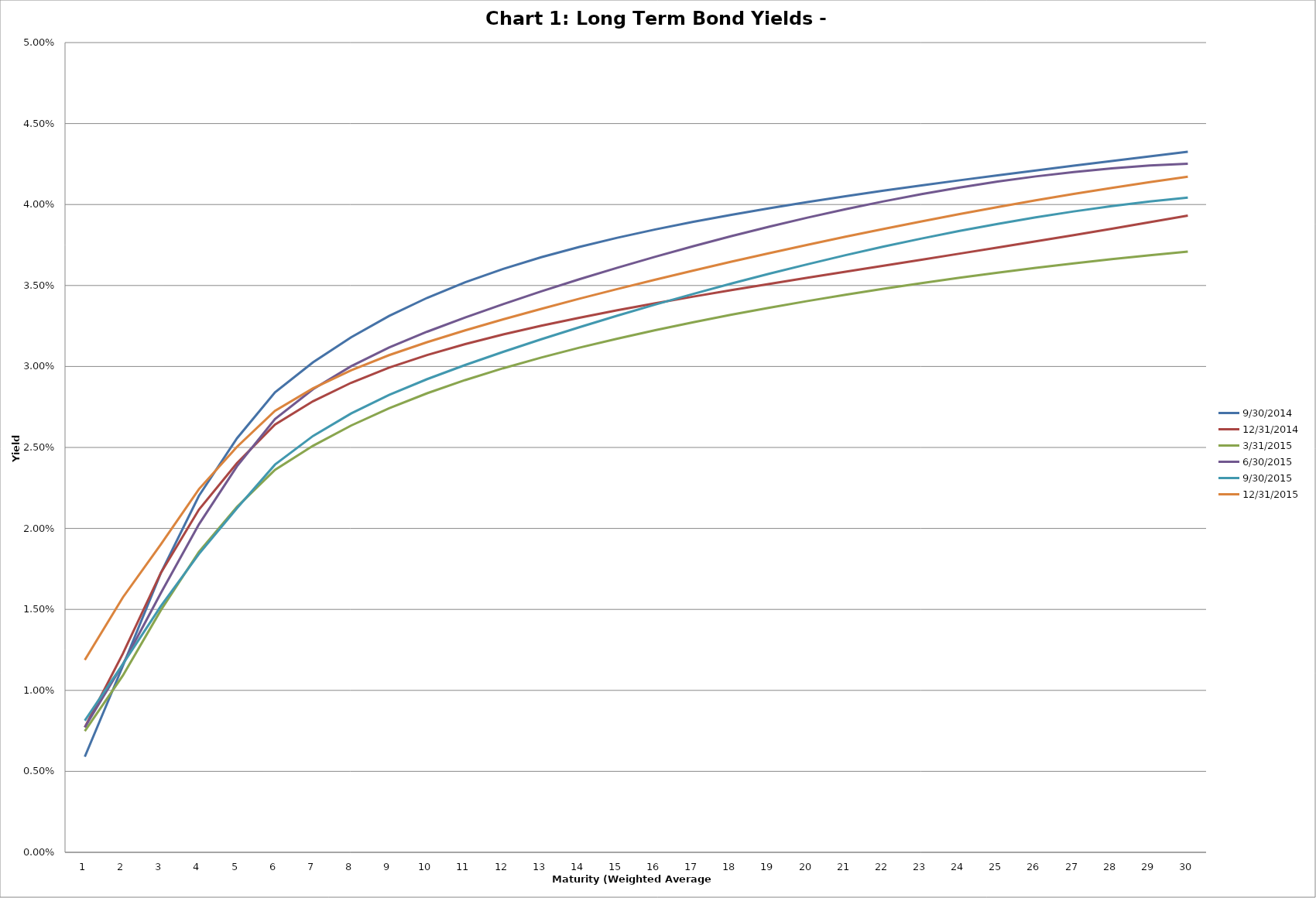
| Category | 9/30/2014 | 12/31/2014 | 3/31/2015 | 6/30/2015 | 9/30/2015 | 12/31/2015 |
|---|---|---|---|---|---|---|
| 0 | 0.006 | 0.008 | 0.007 | 0.008 | 0.008 | 0.012 |
| 1 | 0.012 | 0.012 | 0.011 | 0.012 | 0.012 | 0.016 |
| 2 | 0.017 | 0.017 | 0.015 | 0.016 | 0.015 | 0.019 |
| 3 | 0.022 | 0.021 | 0.019 | 0.02 | 0.018 | 0.022 |
| 4 | 0.026 | 0.024 | 0.021 | 0.024 | 0.021 | 0.025 |
| 5 | 0.028 | 0.026 | 0.024 | 0.027 | 0.024 | 0.027 |
| 6 | 0.03 | 0.028 | 0.025 | 0.029 | 0.026 | 0.029 |
| 7 | 0.032 | 0.029 | 0.026 | 0.03 | 0.027 | 0.03 |
| 8 | 0.033 | 0.03 | 0.027 | 0.031 | 0.028 | 0.031 |
| 9 | 0.034 | 0.031 | 0.028 | 0.032 | 0.029 | 0.032 |
| 10 | 0.035 | 0.031 | 0.029 | 0.033 | 0.03 | 0.032 |
| 11 | 0.036 | 0.032 | 0.03 | 0.034 | 0.031 | 0.033 |
| 12 | 0.037 | 0.033 | 0.031 | 0.035 | 0.032 | 0.034 |
| 13 | 0.037 | 0.033 | 0.031 | 0.035 | 0.032 | 0.034 |
| 14 | 0.038 | 0.033 | 0.032 | 0.036 | 0.033 | 0.035 |
| 15 | 0.038 | 0.034 | 0.032 | 0.037 | 0.034 | 0.035 |
| 16 | 0.039 | 0.034 | 0.033 | 0.037 | 0.034 | 0.036 |
| 17 | 0.039 | 0.035 | 0.033 | 0.038 | 0.035 | 0.036 |
| 18 | 0.04 | 0.035 | 0.034 | 0.039 | 0.036 | 0.037 |
| 19 | 0.04 | 0.035 | 0.034 | 0.039 | 0.036 | 0.038 |
| 20 | 0.041 | 0.036 | 0.034 | 0.04 | 0.037 | 0.038 |
| 21 | 0.041 | 0.036 | 0.035 | 0.04 | 0.037 | 0.038 |
| 22 | 0.041 | 0.037 | 0.035 | 0.041 | 0.038 | 0.039 |
| 23 | 0.041 | 0.037 | 0.035 | 0.041 | 0.038 | 0.039 |
| 24 | 0.042 | 0.037 | 0.036 | 0.041 | 0.039 | 0.04 |
| 25 | 0.042 | 0.038 | 0.036 | 0.042 | 0.039 | 0.04 |
| 26 | 0.042 | 0.038 | 0.036 | 0.042 | 0.04 | 0.041 |
| 27 | 0.043 | 0.039 | 0.037 | 0.042 | 0.04 | 0.041 |
| 28 | 0.043 | 0.039 | 0.037 | 0.042 | 0.04 | 0.041 |
| 29 | 0.043 | 0.039 | 0.037 | 0.043 | 0.04 | 0.042 |